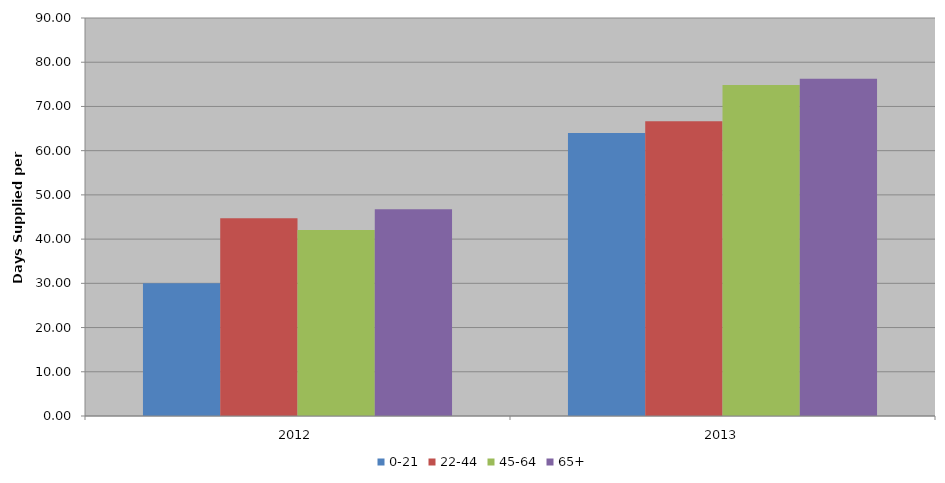
| Category | 0-21 | 22-44 | 45-64 | 65+ |
|---|---|---|---|---|
| 2012 | 30 | 44.7 | 42.054 | 46.774 |
| 2013 | 64 | 66.66 | 74.839 | 76.273 |